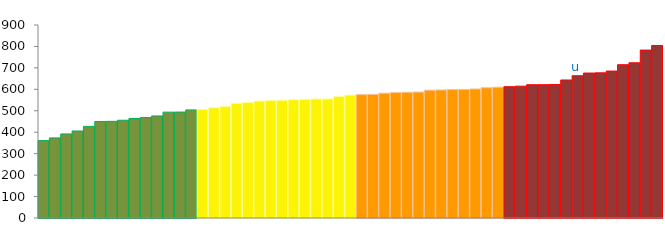
| Category | Top Quartile | 2nd Quartile | 3rd Quartile | Bottom Quartile | Series 4 |
|---|---|---|---|---|---|
|  | 360.9 | 0 | 0 | 0 | 360.9 |
|  | 373.4 | 0 | 0 | 0 | 373.4 |
|  | 392 | 0 | 0 | 0 | 392 |
|  | 405.7 | 0 | 0 | 0 | 405.7 |
|  | 427.2 | 0 | 0 | 0 | 427.2 |
|  | 450.2 | 0 | 0 | 0 | 450.2 |
|  | 450.7 | 0 | 0 | 0 | 450.7 |
|  | 455.9 | 0 | 0 | 0 | 455.9 |
|  | 463.8 | 0 | 0 | 0 | 463.8 |
|  | 468.8 | 0 | 0 | 0 | 468.8 |
|  | 476 | 0 | 0 | 0 | 476 |
|  | 493.7 | 0 | 0 | 0 | 493.7 |
|  | 494 | 0 | 0 | 0 | 494 |
|  | 504 | 0 | 0 | 0 | 504 |
|  | 0 | 505.8 | 0 | 0 | 505.8 |
|  | 0 | 514.2 | 0 | 0 | 514.2 |
|  | 0 | 519.5 | 0 | 0 | 519.5 |
|  | 0 | 534.9 | 0 | 0 | 534.9 |
|  | 0 | 538.5 | 0 | 0 | 538.5 |
|  | 0 | 545.1 | 0 | 0 | 545.1 |
|  | 0 | 548.3 | 0 | 0 | 548.3 |
|  | 0 | 549.2 | 0 | 0 | 549.2 |
|  | 0 | 551.5 | 0 | 0 | 551.5 |
|  | 0 | 553.2 | 0 | 0 | 553.2 |
|  | 0 | 554.9 | 0 | 0 | 554.9 |
|  | 0 | 555.1 | 0 | 0 | 555.1 |
|  | 0 | 567.1 | 0 | 0 | 567.1 |
|  | 0 | 573 | 0 | 0 | 573 |
|  | 0 | 0 | 575.1 | 0 | 575.1 |
|  | 0 | 0 | 576.4 | 0 | 576.4 |
|  | 0 | 0 | 581.8 | 0 | 581.8 |
|  | 0 | 0 | 584.6 | 0 | 584.6 |
|  | 0 | 0 | 586 | 0 | 586 |
|  | 0 | 0 | 587.2 | 0 | 587.2 |
|  | 0 | 0 | 596.3 | 0 | 596.3 |
|  | 0 | 0 | 597 | 0 | 597 |
|  | 0 | 0 | 599.1 | 0 | 599.1 |
|  | 0 | 0 | 599.3 | 0 | 599.3 |
|  | 0 | 0 | 601.6 | 0 | 601.6 |
|  | 0 | 0 | 607.4 | 0 | 607.4 |
|  | 0 | 0 | 609.9 | 0 | 609.9 |
|  | 0 | 0 | 0 | 612.3 | 612.3 |
|  | 0 | 0 | 0 | 614.8 | 614.8 |
|  | 0 | 0 | 0 | 621.6 | 621.6 |
|  | 0 | 0 | 0 | 621.8 | 621.8 |
|  | 0 | 0 | 0 | 622.7 | 622.7 |
|  | 0 | 0 | 0 | 643.6 | 643.6 |
| u | 0 | 0 | 0 | 663.4 | 663.4 |